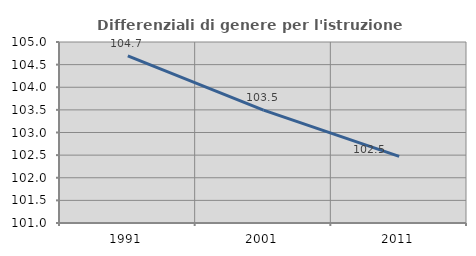
| Category | Differenziali di genere per l'istruzione superiore |
|---|---|
| 1991.0 | 104.694 |
| 2001.0 | 103.495 |
| 2011.0 | 102.472 |